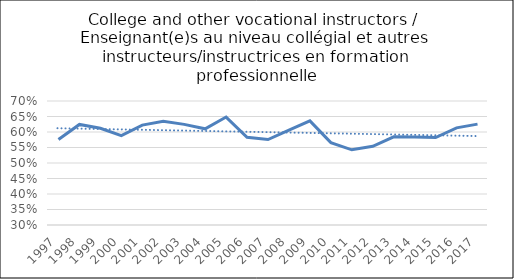
| Category | Series 0 |
|---|---|
| 1997.0 | 0.576 |
| 1998.0 | 0.624 |
| 1999.0 | 0.612 |
| 2000.0 | 0.588 |
| 2001.0 | 0.622 |
| 2002.0 | 0.635 |
| 2003.0 | 0.625 |
| 2004.0 | 0.61 |
| 2005.0 | 0.648 |
| 2006.0 | 0.583 |
| 2007.0 | 0.576 |
| 2008.0 | 0.606 |
| 2009.0 | 0.636 |
| 2010.0 | 0.566 |
| 2011.0 | 0.543 |
| 2012.0 | 0.554 |
| 2013.0 | 0.585 |
| 2014.0 | 0.584 |
| 2015.0 | 0.582 |
| 2016.0 | 0.613 |
| 2017.0 | 0.625 |